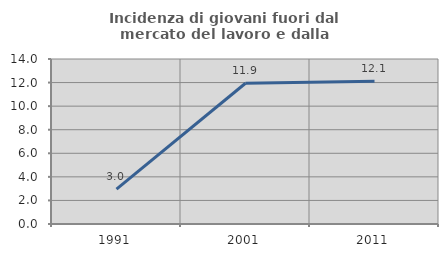
| Category | Incidenza di giovani fuori dal mercato del lavoro e dalla formazione  |
|---|---|
| 1991.0 | 2.956 |
| 2001.0 | 11.94 |
| 2011.0 | 12.121 |